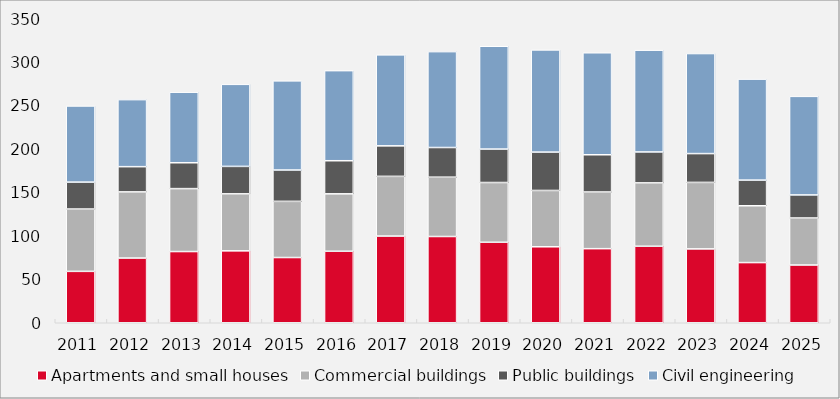
| Category | Apartments and small houses | Commercial buildings | Public buildings | Civil engineering |
|---|---|---|---|---|
| 2011.0 | 59.183 | 71.759 | 30.989 | 87.667 |
| 2012.0 | 74.498 | 76.179 | 29.035 | 77.186 |
| 2013.0 | 81.981 | 72.455 | 29.788 | 81.213 |
| 2014.0 | 82.78 | 65.637 | 31.603 | 94.468 |
| 2015.0 | 75.105 | 64.666 | 36.085 | 102.622 |
| 2016.0 | 82.33 | 66.102 | 38.104 | 103.724 |
| 2017.0 | 99.813 | 68.746 | 35.13 | 104.734 |
| 2018.0 | 99.308 | 68.301 | 34.145 | 110.402 |
| 2019.0 | 92.667 | 68.803 | 38.513 | 118.344 |
| 2020.0 | 87.471 | 64.843 | 44.169 | 117.629 |
| 2021.0 | 85.303 | 65.245 | 42.861 | 117.435 |
| 2022.0 | 88.103 | 72.941 | 35.602 | 117.174 |
| 2023.0 | 85.051 | 76.535 | 33.171 | 115.183 |
| 2024.0 | 69.289 | 65.415 | 29.539 | 116.256 |
| 2025.0 | 66.497 | 54.105 | 26.554 | 113.498 |